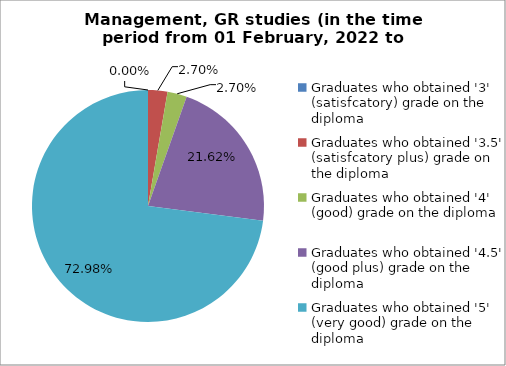
| Category | Series 0 |
|---|---|
| Graduates who obtained '3' (satisfcatory) grade on the diploma  | 0 |
| Graduates who obtained '3.5' (satisfcatory plus) grade on the diploma  | 2.703 |
| Graduates who obtained '4' (good) grade on the diploma  | 2.703 |
| Graduates who obtained '4.5' (good plus) grade on the diploma  | 21.622 |
| Graduates who obtained '5' (very good) grade on the diploma  | 72.973 |